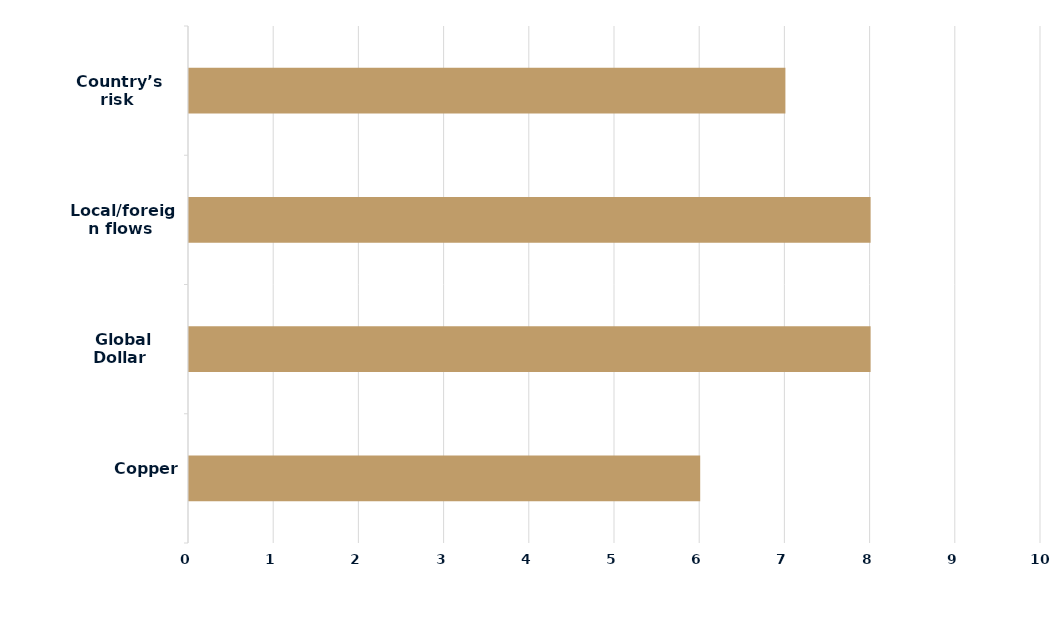
| Category | Series 0 |
|---|---|
|  Copper | 6 |
|  Global Dollar | 8 |
|  Local/foreign flows | 8 |
|  Country’s risk | 7 |